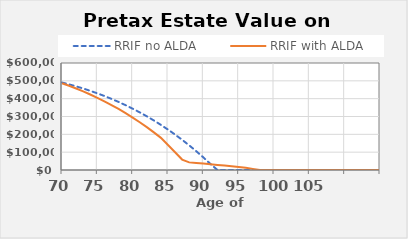
| Category | RRIF no ALDA |  RRIF with ALDA |
|---|---|---|
| 70 | 490500 | 486625 |
| 71 | 480180.5 | 472310.375 |
| 72 | 469005.071 | 457015.972 |
| 73 | 456935.921 | 440700.16 |
| 74 | 443933.854 | 423319.784 |
| 75 | 429958.214 | 404830.108 |
| 76 | 414966.839 | 385184.762 |
| 77 | 398916.01 | 364335.689 |
| 78 | 381760.395 | 342233.084 |
| 79 | 363452.994 | 318825.336 |
| 80 | 343945.081 | 294058.966 |
| 81 | 323186.15 | 267878.565 |
| 82 | 301123.845 | 240226.725 |
| 83 | 277703.907 | 211043.976 |
| 84 | 252870.1 | 180268.711 |
| 85 | 226564.15 | 139778.674 |
| 86 | 198725.672 | 99199.46 |
| 87 | 169292.1 | 58526.095 |
| 88 | 138198.612 | 42753.639 |
| 89 | 105378.053 | 39380.377 |
| 90 | 70760.858 | 35907.028 |
| 91 | 34274.967 | 32330.688 |
| 92 | 0 | 28648.223 |
| 93 | 0 | 24855.198 |
| 94 | 0 | 20955.417 |
| 95 | 0 | 17072.696 |
| 96 | 0 | 12186.931 |
| 97 | 0 | 6248.492 |
| 98 | 0 | 0 |
| 99 | 0 | 0 |
| 100 | 0 | 0 |
| 101 | 0 | 0 |
| 102 | 0 | 0 |
| 103 | 0 | 0 |
| 104 | 0 | 0 |
| 105 | 0 | 0 |